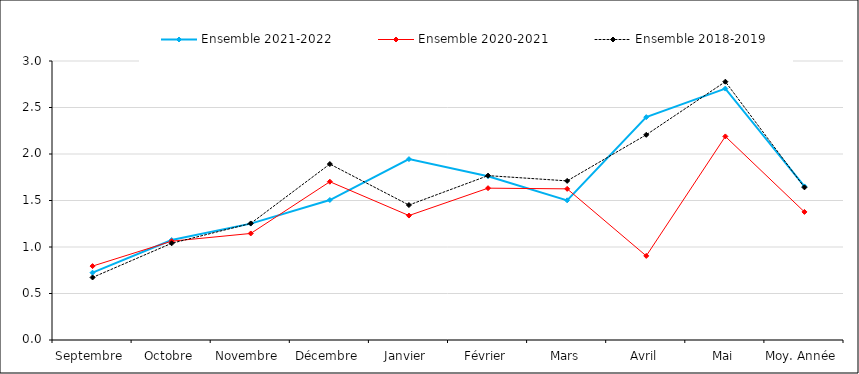
| Category | Ensemble |
|---|---|
| Septembre | 0.673 |
| Octobre | 1.04 |
| Novembre | 1.253 |
| Décembre | 1.892 |
| Janvier | 1.451 |
| Février | 1.767 |
| Mars | 1.711 |
| Avril | 2.206 |
| Mai | 2.778 |
| Moy. Année | 1.641 |